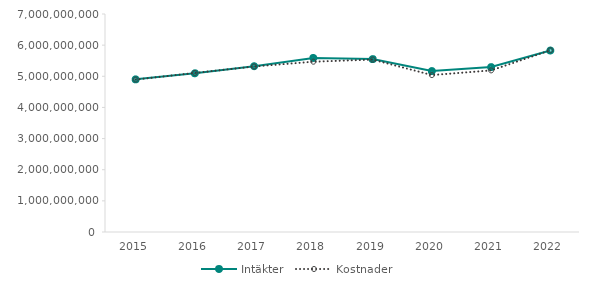
| Category | Intäkter | Kostnader |
|---|---|---|
| 2015.0 | 4901860396 | 4895120209 |
| 2016.0 | 5096097914 | 5107933390 |
| 2017.0 | 5323369330 | 5314799403 |
| 2018.0 | 5588169836 | 5468351876 |
| 2019.0 | 5551172925 | 5536790020 |
| 2020.0 | 5167795438 | 5038606026 |
| 2021.0 | 5295520407 | 5189078872 |
| 2022.0 | 5827981532 | 5835953627 |